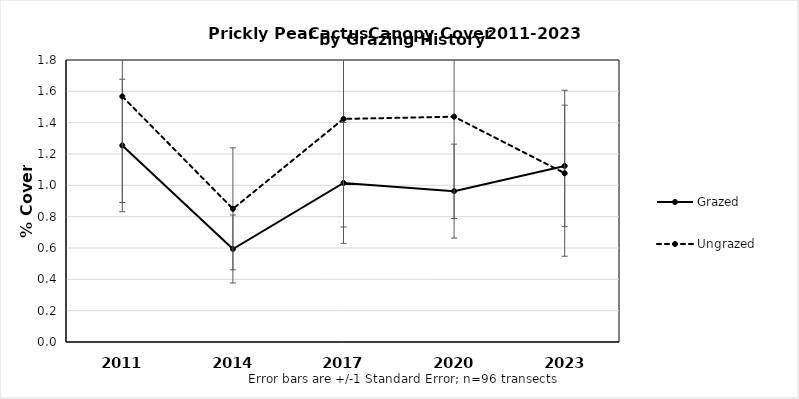
| Category | Grazed | Ungrazed |
|---|---|---|
| 2011.0 | 1.254 | 1.567 |
| 2014.0 | 0.593 | 0.85 |
| 2017.0 | 1.015 | 1.424 |
| 2020.0 | 0.963 | 1.438 |
| 2023.0 | 1.124 | 1.077 |